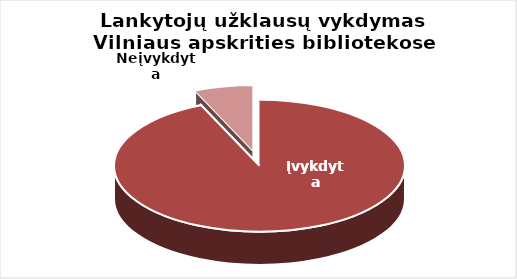
| Category | Series 0 |
|---|---|
| Įvykdyta | 407149 |
| Neįvykdyta | 28588 |